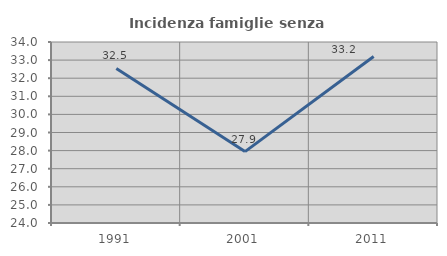
| Category | Incidenza famiglie senza nuclei |
|---|---|
| 1991.0 | 32.54 |
| 2001.0 | 27.945 |
| 2011.0 | 33.198 |